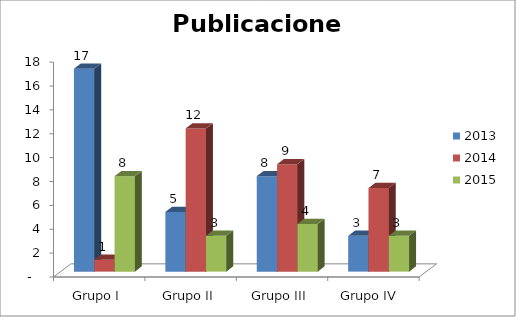
| Category | 2013 | 2014 | 2015 |
|---|---|---|---|
| Grupo I | 17 | 1 | 8 |
| Grupo II | 5 | 12 | 3 |
| Grupo III | 8 | 9 | 4 |
| Grupo IV  | 3 | 7 | 3 |